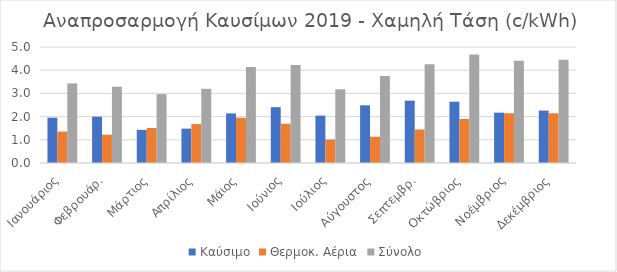
| Category | Καύσιμο | Θερμοκ. Αέρια | Σύνολο |
|---|---|---|---|
| Ιανουάριος | 1.952 | 1.355 | 3.432 |
| Φεβρουάρ. | 1.997 | 1.22 | 3.286 |
| Μάρτιος | 1.427 | 1.51 | 2.969 |
| Απρίλιος | 1.482 | 1.678 | 3.197 |
| Μάιος | 2.138 | 1.949 | 4.143 |
| Ιούνιος | 2.406 | 1.694 | 4.228 |
| Ιούλιος | 2.044 | 1.012 | 3.178 |
| Αύγουστος | 2.488 | 1.132 | 3.746 |
| Σεπτεμβρ. | 2.688 | 1.444 | 4.255 |
| Οκτώβριος | 2.641 | 1.897 | 4.676 |
| Νοέμβριος | 2.17 | 2.143 | 4.403 |
| Δεκέμβριος | 2.26 | 2.144 | 4.448 |